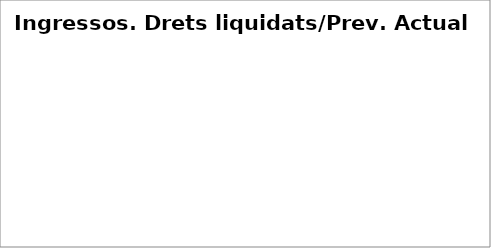
| Category | Series 0 |
|---|---|
| Impostos directes | 0.565 |
| Impostos indirectes | 0.545 |
| Taxes, preus públics i altres ingressos | 0.41 |
| Transferències corrents | 0.484 |
| Ingressos patrimonials | 0.329 |
| Venda d'inversions reals | 0.188 |
| Transferències de capital | 0.103 |
| Actius financers* | 0 |
| Passius financers | 0.008 |